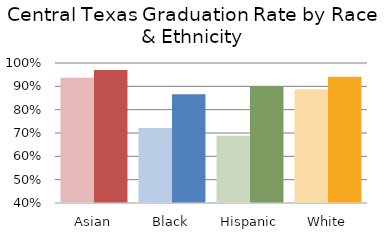
| Category | Class of 2009 | Class of 2018 |
|---|---|---|
| Asian | 0.937 | 0.97 |
| Black | 0.721 | 0.866 |
| Hispanic | 0.688 | 0.9 |
| White | 0.888 | 0.941 |